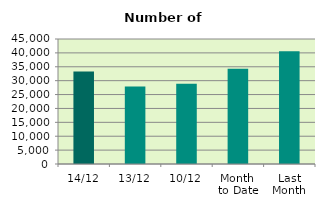
| Category | Series 0 |
|---|---|
| 14/12 | 33278 |
| 13/12 | 27924 |
| 10/12 | 28908 |
| Month 
to Date | 34321.8 |
| Last
Month | 40546.091 |